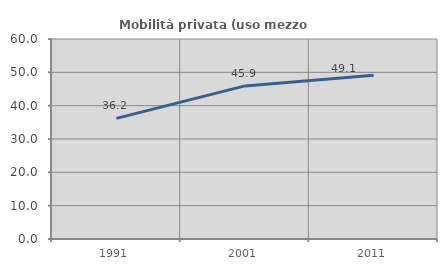
| Category | Mobilità privata (uso mezzo privato) |
|---|---|
| 1991.0 | 36.195 |
| 2001.0 | 45.927 |
| 2011.0 | 49.11 |